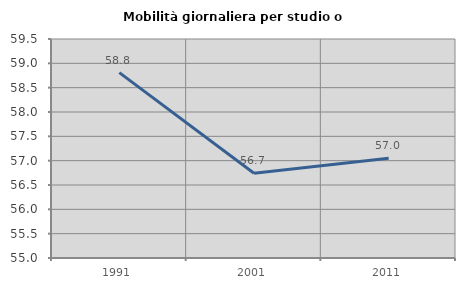
| Category | Mobilità giornaliera per studio o lavoro |
|---|---|
| 1991.0 | 58.81 |
| 2001.0 | 56.742 |
| 2011.0 | 57.049 |